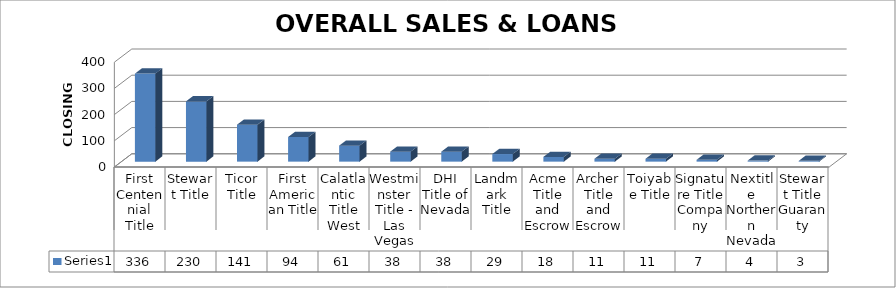
| Category | Series 0 |
|---|---|
| First Centennial Title | 336 |
| Stewart Title | 230 |
| Ticor Title | 141 |
| First American Title | 94 |
| Calatlantic Title West | 61 |
| Westminster Title - Las Vegas | 38 |
| DHI Title of Nevada | 38 |
| Landmark Title | 29 |
| Acme Title and Escrow | 18 |
| Archer Title and Escrow | 11 |
| Toiyabe Title | 11 |
| Signature Title Company | 7 |
| Nextitle Northern Nevada | 4 |
| Stewart Title Guaranty | 3 |